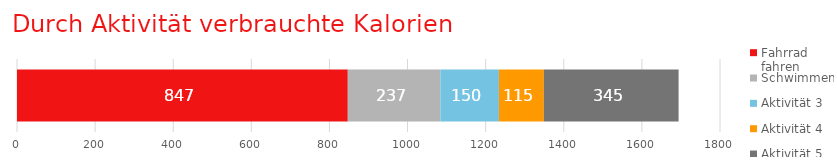
| Category | Fahrrad fahren | Schwimmen | Aktivität 3 | Aktivität 4 | Aktivität 5 |
|---|---|---|---|---|---|
| Aktivitätentracker | 847 | 237 | 150 | 115 | 345 |